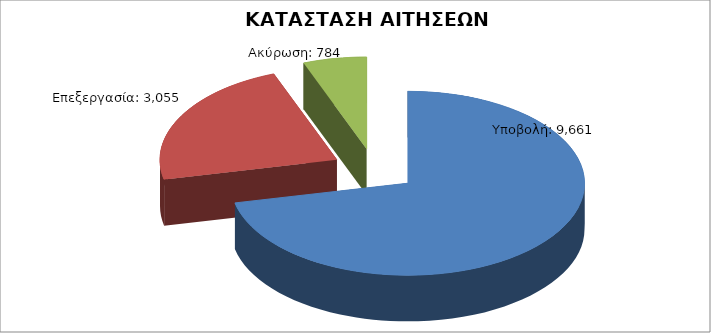
| Category | Series 0 |
|---|---|
| Υποβολή: | 9661 |
| Επεξεργασία: | 3055 |
| Ακύρωση: | 784 |